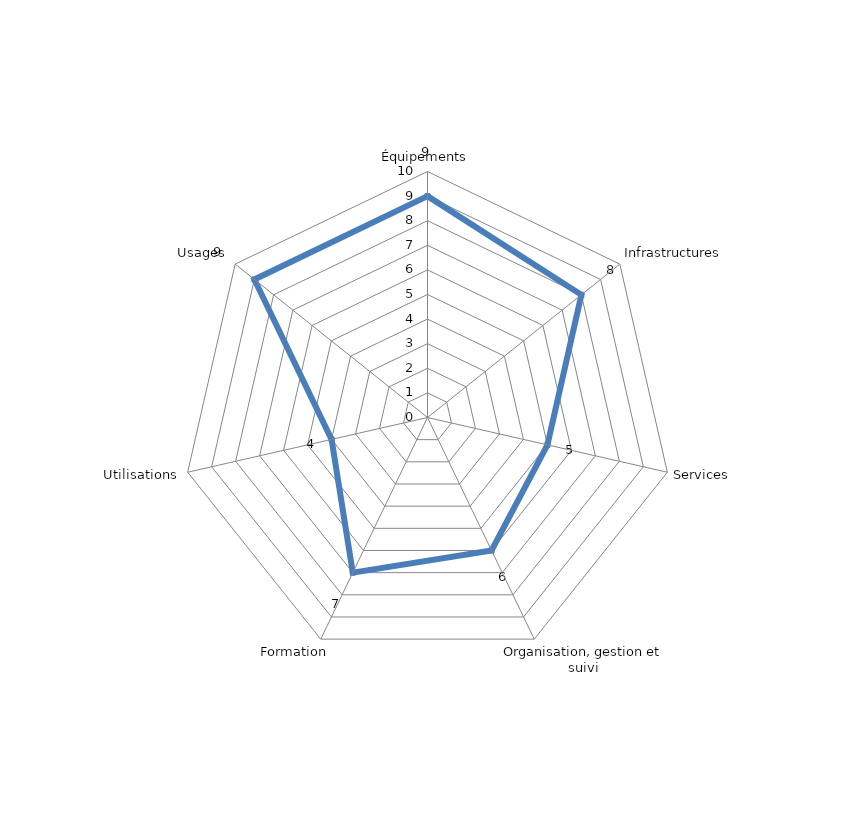
| Category | Series 0 |
|---|---|
| Équipements | 9 |
| Infrastructures | 8 |
| Services | 5 |
| Organisation, gestion et suivi | 6 |
| Formation | 7 |
| Utilisations | 4 |
| Usages | 9 |